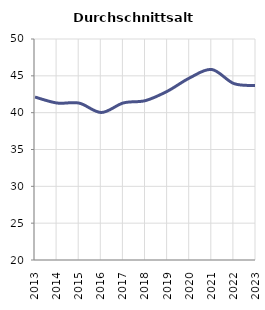
| Category | Durchschnittsalter |
|---|---|
| 2013.0 | 42.12 |
| 2014.0 | 41.307 |
| 2015.0 | 41.297 |
| 2016.0 | 40.023 |
| 2017.0 | 41.322 |
| 2018.0 | 41.637 |
| 2019.0 | 42.926 |
| 2020.0 | 44.72 |
| 2021.0 | 45.861 |
| 2022.0 | 43.95 |
| 2023.0 | 43.683 |